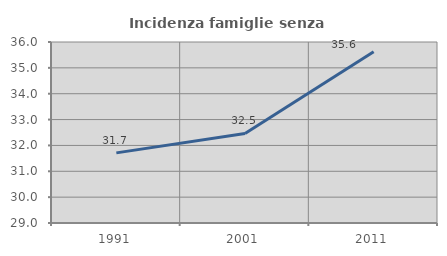
| Category | Incidenza famiglie senza nuclei |
|---|---|
| 1991.0 | 31.712 |
| 2001.0 | 32.465 |
| 2011.0 | 35.621 |